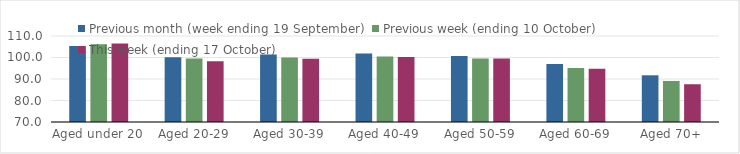
| Category | Previous month (week ending 19 September) | Previous week (ending 10 October) | This week (ending 17 October) |
|---|---|---|---|
| Aged under 20 | 105.38 | 106.2 | 106.54 |
| Aged 20-29 | 100.13 | 99.58 | 98.25 |
| Aged 30-39 | 101.36 | 100.01 | 99.42 |
| Aged 40-49 | 101.86 | 100.42 | 100.21 |
| Aged 50-59 | 100.67 | 99.48 | 99.5 |
| Aged 60-69 | 96.94 | 95.11 | 94.74 |
| Aged 70+ | 91.72 | 89.09 | 87.57 |